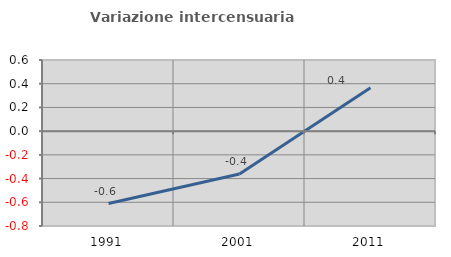
| Category | Variazione intercensuaria annua |
|---|---|
| 1991.0 | -0.611 |
| 2001.0 | -0.362 |
| 2011.0 | 0.367 |